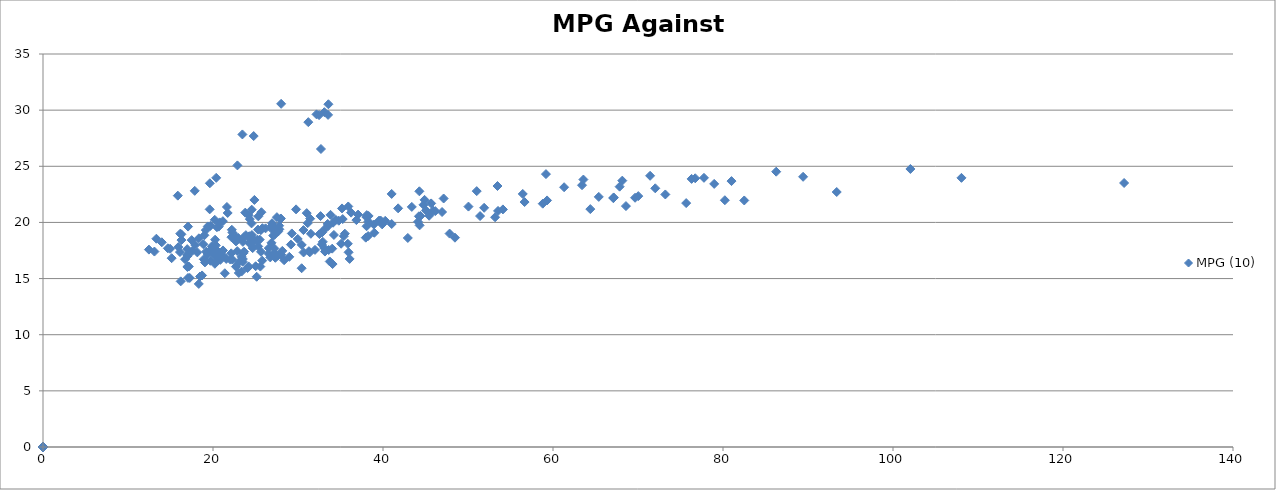
| Category | MPG (10) |
|---|---|
| 0.0 | 0 |
| 0.0 | 0 |
| 0.0 | 0 |
| 0.0 | 0 |
| 0.0 | 0 |
| 0.0 | 0 |
| 0.0 | 0 |
| 0.0 | 0 |
| 0.0 | 0 |
| 23.458823529411763 | 27.837 |
| 22.870967741935484 | 25.08 |
| 19.62857142857143 | 23.487 |
| 17.854545454545455 | 22.813 |
| 21.638297872340427 | 21.377 |
| 20.333333333333332 | 17.956 |
| 21.164835164835164 | 20.111 |
| 20.78494623655914 | 20.002 |
| 20.462365591397848 | 19.574 |
| 20.376237623762375 | 23.972 |
| 19.150537634408604 | 19.315 |
| 19.608695652173914 | 21.166 |
| 20.20689655172414 | 20.232 |
| 18.98913043478261 | 18.856 |
| 17.489795918367346 | 18.426 |
| 16.11340206185567 | 17.361 |
| 16.96629213483146 | 17.622 |
| 16.70967741935484 | 16.722 |
| 16.197802197802197 | 14.752 |
| 17.151515151515152 | 16.073 |
| 16.989247311827956 | 16.031 |
| 17.043010752688172 | 16.093 |
| 17.263736263736263 | 15.054 |
| 18.32894736842105 | 14.523 |
| 20.525641025641026 | 17.417 |
| 19.048192771084338 | 16.44 |
| 19.691358024691358 | 16.585 |
| 20.2 | 17.036 |
| 19.985915492957748 | 17.413 |
| 20.3 | 17.63 |
| 20.27536231884058 | 17.584 |
| 22.29230769230769 | 16.688 |
| 21.727272727272727 | 20.842 |
| 21.176470588235293 | 17.505 |
| 22.703125 | 18.309 |
| 23.65573770491803 | 17.394 |
| 24.580645161290324 | 18.88 |
| 25.224137931034484 | 18.456 |
| 27.925925925925927 | 20.304 |
| 29.163265306122447 | 18.027 |
| 30.44 | 17.999 |
| 33.18181818181818 | 19.425 |
| 32.79545454545455 | 18.049 |
| 35.26086956521739 | 20.3 |
| 34.12765957446808 | 19.975 |
| 35.075 | 18.103 |
| 32.84 | 19.115 |
| 34.224489795918366 | 18.885 |
| 32.52542372881356 | 18.962 |
| 31.516129032258064 | 18.989 |
| 38.27777777777778 | 20.087 |
| 38.035714285714285 | 20.481 |
| 39.53703703703704 | 20.161 |
| 40.25925925925926 | 20.145 |
| 44.767857142857146 | 21.571 |
| 51.9 | 21.302 |
| 44.892857142857146 | 22.01 |
| 53.46938775510204 | 23.243 |
| 59.3 | 21.959 |
| 59.170731707317074 | 24.304 |
| 63.416666666666664 | 23.315 |
| 72.03225806451613 | 23.04 |
| 89.42307692307692 | 24.063 |
| 82.5 | 21.955 |
| 93.38095238095238 | 22.71 |
| 108.05263157894737 | 23.97 |
| 127.1875 | 23.512 |
| 102.04761904761905 | 24.76 |
| 80.21739130434783 | 21.977 |
| 75.66666666666667 | 21.722 |
| 73.21428571428571 | 22.49 |
| 58.794117647058826 | 21.669 |
| 56.44117647058823 | 22.537 |
| 51.027027027027025 | 22.788 |
| 44.225 | 20.546 |
| 29.274509803921568 | 19.019 |
| 26.875 | 19.444 |
| 26.946428571428573 | 19.725 |
| 23.866666666666667 | 18.867 |
| 20.24590163934426 | 18.46 |
| 19.35593220338983 | 17.199 |
| 17.90909090909091 | 17.991 |
| 17.015384615384615 | 17.015 |
| 16.953846153846154 | 17.112 |
| 19.20689655172414 | 17.406 |
| 20.615384615384617 | 16.672 |
| 21.115384615384617 | 17.076 |
| 22.040816326530614 | 16.692 |
| 20.865384615384617 | 16.667 |
| 20.90566037735849 | 16.89 |
| 23.06382978723404 | 16.474 |
| 23.51063829787234 | 16.742 |
| 25.13953488372093 | 15.161 |
| 24.28301886792453 | 18.152 |
| 22.69811320754717 | 16.061 |
| 22.966666666666665 | 18.622 |
| 23.655172413793103 | 18.692 |
| 24.267857142857142 | 18.771 |
| 24.425925925925927 | 18.473 |
| 25.81132075471698 | 19.487 |
| 24.535714285714285 | 19.913 |
| 24.189655172413794 | 20.632 |
| 24.82608695652174 | 18.36 |
| 29.772727272727273 | 21.163 |
| 31.43243243243243 | 20.332 |
| 30.63888888888889 | 19.317 |
| 31.28125 | 17.439 |
| 35.911764705882355 | 21.421 |
| 31.026315789473685 | 20.83 |
| 34.45454545454545 | 20.231 |
| 25.333333333333332 | 20.541 |
| 24.5531914893617 | 21.136 |
| 19.38888888888889 | 19.644 |
| 18.339622641509433 | 18.585 |
| 17.06779661016949 | 19.63 |
| 15.859154929577464 | 22.386 |
| 13.338235294117647 | 18.548 |
| 13.109375 | 17.407 |
| 12.462686567164178 | 17.579 |
| 15.134615384615385 | 16.816 |
| 15.923076923076923 | 17.806 |
| 17.0625 | 15.055 |
| 24.78688524590164 | 27.692 |
| 28.016666666666666 | 30.564 |
| 33.1 | 29.82 |
| 31.21153846153846 | 28.93 |
| 33.54 | 29.577 |
| 33.57692307692308 | 30.524 |
| 32.7037037037037 | 26.54 |
| 32.17741935483871 | 29.626 |
| 32.483870967741936 | 29.557 |
| 24.87037037037037 | 22.002 |
| 22.28301886792453 | 19.098 |
| 21.557692307692307 | 16.746 |
| 24.333333333333332 | 20.296 |
| 22.21311475409836 | 19.346 |
| 22.71186440677966 | 18.705 |
| 22.866666666666667 | 18.506 |
| 21.392156862745097 | 15.475 |
| 25.02173913043478 | 16.098 |
| 24.18867924528302 | 16.085 |
| 25.649122807017545 | 17.384 |
| 25.317460317460316 | 17.861 |
| 23.360655737704917 | 15.625 |
| 24.066666666666666 | 15.938 |
| 25.56896551724138 | 16.067 |
| 26.737704918032787 | 16.884 |
| 26.560606060606062 | 17.707 |
| 23.571428571428573 | 17.259 |
| 28.36842105263158 | 16.636 |
| 28.155172413793103 | 17.465 |
| 27.333333333333332 | 16.848 |
| 26.546875 | 17.216 |
| 27.80597014925373 | 19.388 |
| 27.666666666666668 | 19.188 |
| 29.967741935483872 | 18.526 |
| 27.785714285714285 | 19.708 |
| 27.985507246376812 | 20.35 |
| 25.696202531645568 | 20.908 |
| 25.293333333333333 | 19.359 |
| 25.63013698630137 | 19.311 |
| 26.955882352941178 | 19.935 |
| 27.0 | 19.548 |
| 26.184615384615384 | 19.474 |
| 23.514285714285716 | 18.269 |
| 30.653846153846153 | 17.326 |
| 41.02 | 22.538 |
| 44.41860465116279 | 20.582 |
| 45.904761904761905 | 21.048 |
| 53.189189189189186 | 20.46 |
| 68.58064516129032 | 21.455 |
| 71.42424242424242 | 24.152 |
| 76.73333333333333 | 23.932 |
| 86.25925925925925 | 24.518 |
| 78.96296296296296 | 23.431 |
| 67.14285714285714 | 22.225 |
| 76.3076923076923 | 23.878 |
| 81.0 | 23.681 |
| 77.76 | 23.973 |
| 68.15384615384616 | 23.722 |
| 64.3913043478261 | 21.187 |
| 67.08695652173913 | 22.17 |
| 67.1304347826087 | 22.184 |
| 63.57692307692308 | 23.818 |
| 61.30769230769231 | 23.135 |
| 53.535714285714285 | 21.024 |
| 54.107142857142854 | 21.159 |
| 48.46666666666667 | 18.641 |
| 38.30952380952381 | 20.575 |
| 41.02439024390244 | 19.858 |
| 43.390243902439025 | 21.382 |
| 46.945945945945944 | 20.928 |
| 38.06818181818182 | 19.66 |
| 36.244897959183675 | 20.87 |
| 34.795918367346935 | 20.154 |
| 35.391304347826086 | 18.777 |
| 38.976190476190474 | 19.079 |
| 51.41935483870968 | 20.568 |
| 45.42857142857143 | 20.596 |
| 37.973684210526315 | 18.643 |
| 37.06818181818182 | 20.698 |
| 47.13513513513514 | 22.132 |
| 45.05882352941177 | 21.073 |
| 44.121212121212125 | 20.055 |
| 46.15151515151515 | 21.007 |
| 44.27777777777778 | 22.771 |
| 38.916666666666664 | 19.816 |
| 35.51282051282051 | 18.999 |
| 38.25 | 18.786 |
| 33.17142857142857 | 17.406 |
| 30.428571428571427 | 15.919 |
| 33.083333333333336 | 17.723 |
| 33.73684210526316 | 16.521 |
| 36.07692307692308 | 16.75 |
| 33.61363636363637 | 17.544 |
| 31.382978723404257 | 17.333 |
| 35.86046511627907 | 18.099 |
| 35.951219512195124 | 17.341 |
| 34.06818181818182 | 16.293 |
| 32.92156862745098 | 18.27 |
| 28.035714285714285 | 17.121 |
| 27.24137931034483 | 17.268 |
| 23.03448275862069 | 15.499 |
| 23.362068965517242 | 16.938 |
| 22.852459016393443 | 17.447 |
| 20.21875 | 16.318 |
| 18.914285714285715 | 16.717 |
| 18.476923076923075 | 15.183 |
| 20.6 | 17.167 |
| 22.142857142857142 | 17.246 |
| 23.49019607843137 | 16.501 |
| 25.490909090909092 | 18.472 |
| 24.527272727272727 | 18.181 |
| 26.88 | 18.187 |
| 28.97826086956522 | 16.938 |
| 34.023809523809526 | 17.664 |
| 41.78048780487805 | 21.253 |
| 39.9 | 19.826 |
| 44.30555555555556 | 19.74 |
| 38.08888888888889 | 20.651 |
| 36.86666666666667 | 20.207 |
| 33.56521739130435 | 19.694 |
| 31.14 | 19.936 |
| 32.6530612244898 | 20.566 |
| 27.51851851851852 | 20.468 |
| 22.16949152542373 | 18.686 |
| 19.857142857142858 | 17.871 |
| 18.865671641791046 | 18.057 |
| 18.716666666666665 | 15.279 |
| 24.666666666666668 | 17.713 |
| 32.0 | 17.556 |
| 42.91891891891892 | 18.617 |
| 47.833333333333336 | 19.007 |
| 56.65714285714286 | 21.815 |
| 65.38709677419355 | 22.275 |
| 69.65517241379311 | 22.198 |
| 70.03448275862068 | 22.343 |
| 67.83870967741936 | 23.186 |
| 50.054054054054056 | 21.41 |
| 45.666666666666664 | 21.693 |
| 33.829787234042556 | 20.676 |
| 27.22 | 17.682 |
| 27.47826086956522 | 16.992 |
| 24.836363636363636 | 18.437 |
| 25.78846153846154 | 16.599 |
| 27.232142857142858 | 18.899 |
| 27.089285714285715 | 18.824 |
| 27.607843137254903 | 17.048 |
| 33.48979591836735 | 19.869 |
| 39.73809523809524 | 20.159 |
| 35.18 | 21.247 |
| 23.794117647058822 | 20.872 |
| 20.676056338028168 | 19.626 |
| 19.69333333333333 | 19.693 |
| 16.15 | 19 |
| 16.27848101265823 | 18.94 |
| 16.2875 | 18.43 |
| 14.949367088607595 | 17.653 |
| 13.977011494252874 | 18.231 |
| 14.6875 | 17.696 |
| 17.575757575757574 | 17.47 |
| 19.576271186440678 | 17.447 |
| 18.158730158730158 | 17.333 |
| 20.30909090909091 | 17.053 |